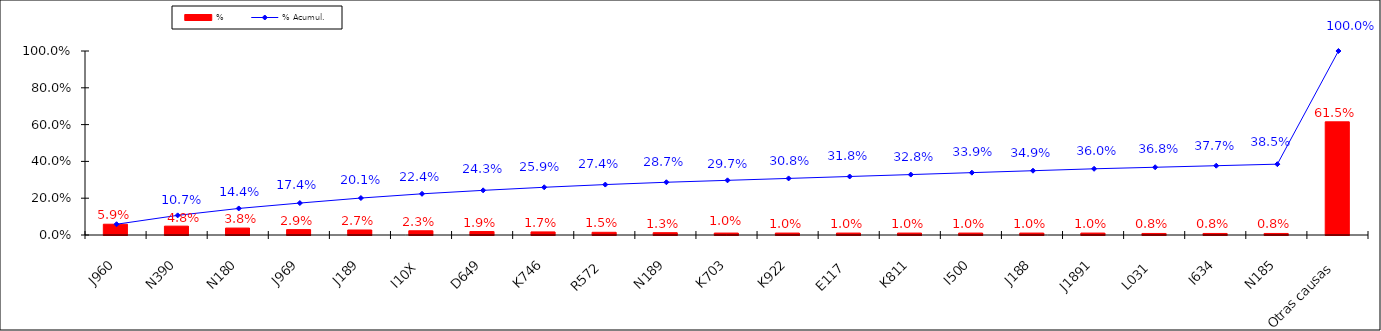
| Category | % |
|---|---|
| J960 | 0.059 |
| N390 | 0.048 |
| N180 | 0.038 |
| J969 | 0.029 |
| J189 | 0.027 |
| I10X | 0.023 |
| D649 | 0.019 |
| K746 | 0.017 |
| R572 | 0.015 |
| N189 | 0.013 |
| K703 | 0.01 |
| K922 | 0.01 |
| E117 | 0.01 |
| K811 | 0.01 |
| I500 | 0.01 |
| J188 | 0.01 |
| J1891 | 0.01 |
| L031 | 0.008 |
| I634 | 0.008 |
| N185 | 0.008 |
| Otras causas | 0.615 |